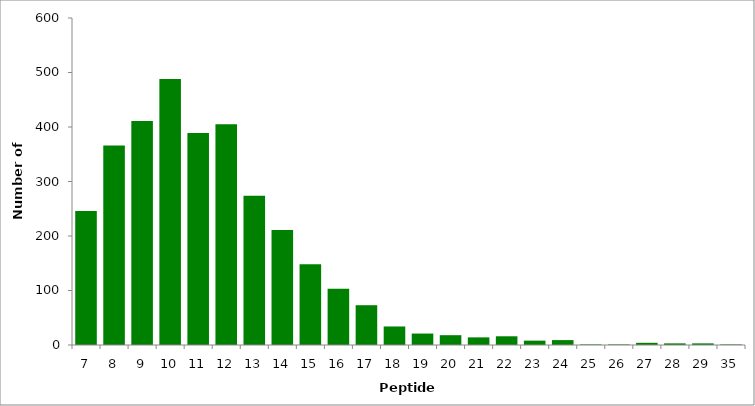
| Category | Series 0 |
|---|---|
| 7.0 | 246 |
| 8.0 | 366 |
| 9.0 | 411 |
| 10.0 | 488 |
| 11.0 | 389 |
| 12.0 | 405 |
| 13.0 | 274 |
| 14.0 | 211 |
| 15.0 | 148 |
| 16.0 | 103 |
| 17.0 | 73 |
| 18.0 | 34 |
| 19.0 | 21 |
| 20.0 | 18 |
| 21.0 | 14 |
| 22.0 | 16 |
| 23.0 | 8 |
| 24.0 | 9 |
| 25.0 | 1 |
| 26.0 | 1 |
| 27.0 | 4 |
| 28.0 | 3 |
| 29.0 | 3 |
| 35.0 | 1 |